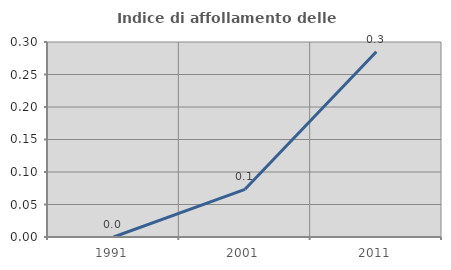
| Category | Indice di affollamento delle abitazioni  |
|---|---|
| 1991.0 | 0 |
| 2001.0 | 0.073 |
| 2011.0 | 0.285 |